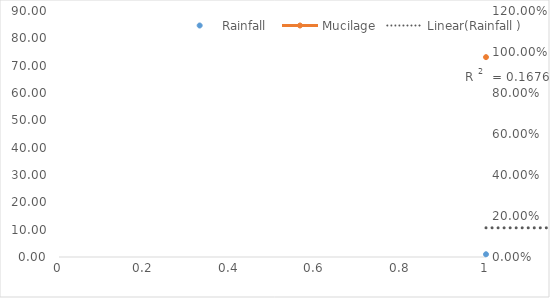
| Category | Rainfall  |
|---|---|
| 0 | 1 |
| 1 | 13.2 |
| 2 | 0.2 |
| 3 | 72.2 |
| 4 | 9.6 |
| 5 | 13.6 |
| 6 | 0.4 |
| 7 | 22.8 |
| 8 | 15.4 |
| 9 | 0 |
| 10 | 29.2 |
| 11 | 15.4 |
| 12 | 1.4 |
| 13 | 9.4 |
| 14 | 2.4 |
| 15 | 21.8 |
| 16 | 0.4 |
| 17 | 14.8 |
| 18 | 7 |
| 19 | 0 |
| 20 | 0 |
| 21 | 20 |
| 22 | 21.6 |
| 23 | 26.8 |
| 24 | 2.2 |
| 25 | 5.6 |
| 26 | 35 |
| 27 | 0 |
| 28 | 0.2 |
| 29 | 0.2 |
| 30 | 33 |
| 31 | 8.4 |
| 32 | 8.4 |
| 33 | 0 |
| 34 | 0 |
| 35 | 23.8 |
| 36 | 10.8 |
| 37 | 0.4 |
| 38 | 3 |
| 39 | 0.4 |
| 40 | 0 |
| 41 | 35.6 |
| 42 | 8.4 |
| 43 | 17.2 |
| 44 | 0.2 |
| 45 | 4.2 |
| 46 | 1.4 |
| 47 | 0.6 |
| 48 | 6.2 |
| 49 | 39.8 |
| 50 | 1.4 |
| 51 | 0.2 |
| 52 | 28.4 |
| 53 | 1.6 |
| 54 | 11 |
| 55 | 0.8 |
| 56 | 1.6 |
| 57 | 6.8 |
| 58 | 0.2 |
| 59 | 0.2 |
| 60 | 0 |
| 61 | 4.8 |
| 62 | 36.6 |
| 63 | 43.6 |
| 64 | 3 |
| 65 | 0.2 |
| 66 | 19.4 |
| 67 | 11.6 |
| 68 | 8.4 |
| 69 | 1.6 |
| 70 | 13.2 |
| 71 | 0 |
| 72 | 15.2 |
| 73 | 0 |
| 74 | 3 |
| 75 | 26.2 |
| 76 | 78.4 |
| 77 | 4.2 |
| 78 | 36.4 |
| 79 | 0 |
| 80 | 0 |
| 81 | 6 |
| 82 | 25.4 |
| 83 | 1.2 |
| 84 | 10.6 |
| 85 | 8.2 |
| 86 | 19.8 |
| 87 | 0 |
| 88 | 14 |
| 89 | 0 |
| 90 | 0 |
| 91 | 0 |
| 92 | 0.6 |
| 93 | 9 |
| 94 | 11.6 |
| 95 | 15.2 |
| 96 | 0 |
| 97 | 0.2 |
| 98 | 19 |
| 99 | 0.2 |
| 100 | 2.2 |
| 101 | 0.6 |
| 102 | 0.6 |
| 103 | 0.6 |
| 104 | 0 |
| 105 | 0.2 |
| 106 | 40 |
| 107 | 0 |
| 108 | 0 |
| 109 | 0 |
| 110 | 6.6 |
| 111 | 23.6 |
| 112 | 7.8 |
| 113 | 3.8 |
| 114 | 0 |
| 115 | 0 |
| 116 | 0 |
| 117 | 0 |
| 118 | 0.6 |
| 119 | 0 |
| 120 | 0 |
| 121 | 0 |
| 122 | 0 |
| 123 | 0 |
| 124 | 0.2 |
| 125 | 3.6 |
| 126 | 0 |
| 127 | 0.2 |
| 128 | 1 |
| 129 | 0 |
| 130 | 2.2 |
| 131 | 0 |
| 132 | 0 |
| 133 | 0 |
| 134 | 6.2 |
| 135 | 1 |
| 136 | 0 |
| 137 | 40.6 |
| 138 | 0 |
| 139 | 2.6 |
| 140 | 0 |
| 141 | 4.6 |
| 142 | 0.4 |
| 143 | 0 |
| 144 | 0 |
| 145 | 0 |
| 146 | 8.4 |
| 147 | 0 |
| 148 | 0 |
| 149 | 0 |
| 150 | 5.8 |
| 151 | 0 |
| 152 | 9.2 |
| 153 | 0 |
| 154 | 0 |
| 155 | 0 |
| 156 | 8.8 |
| 157 | 9.2 |
| 158 | 1.2 |
| 159 | 0 |
| 160 | 0 |
| 161 | 0 |
| 162 | 0 |
| 163 | 0 |
| 164 | 0 |
| 165 | 0 |
| 166 | 0 |
| 167 | 0 |
| 168 | 0 |
| 169 | 0 |
| 170 | 0 |
| 171 | 0 |
| 172 | 0 |
| 173 | 0 |
| 174 | 0 |
| 175 | 0 |
| 176 | 0 |
| 177 | 0 |
| 178 | 0 |
| 179 | 0 |
| 180 | 0 |
| 181 | 0 |
| 182 | 0 |
| 183 | 0 |
| 184 | 0 |
| 185 | 0 |
| 186 | 0 |
| 187 | 0 |
| 188 | 0 |
| 189 | 0 |
| 190 | 0 |
| 191 | 0 |
| 192 | 0 |
| 193 | 0 |
| 194 | 0.2 |
| 195 | 0 |
| 196 | 0 |
| 197 | 0 |
| 198 | 0 |
| 199 | 0 |
| 200 | 0 |
| 201 | 0 |
| 202 | 0 |
| 203 | 0 |
| 204 | 0 |
| 205 | 0 |
| 206 | 0 |
| 207 | 0 |
| 208 | 0 |
| 209 | 0 |
| 210 | 0 |
| 211 | 0 |
| 212 | 0 |
| 213 | 0 |
| 214 | 0.2 |
| 215 | 0.2 |
| 216 | 0 |
| 217 | 0 |
| 218 | 0.2 |
| 219 | 0 |
| 220 | 0 |
| 221 | 0 |
| 222 | 0 |
| 223 | 0 |
| 224 | 0 |
| 225 | 0 |
| 226 | 0 |
| 227 | 0 |
| 228 | 0.2 |
| 229 | 0 |
| 230 | 0 |
| 231 | 0 |
| 232 | 0 |
| 233 | 0 |
| 234 | 0.2 |
| 235 | 0 |
| 236 | 0.2 |
| 237 | 0 |
| 238 | 0.2 |
| 239 | 0 |
| 240 | 8 |
| 241 | 0 |
| 242 | 0 |
| 243 | 0 |
| 244 | 0.2 |
| 245 | 0 |
| 246 | 0 |
| 247 | 0 |
| 248 | 0 |
| 249 | 0 |
| 250 | 0 |
| 251 | 0 |
| 252 | 0 |
| 253 | 0 |
| 254 | 0 |
| 255 | 0.2 |
| 256 | 0 |
| 257 | 0 |
| 258 | 12.4 |
| 259 | 0 |
| 260 | 0 |
| 261 | 0 |
| 262 | 0 |
| 263 | 0 |
| 264 | 0 |
| 265 | 0 |
| 266 | 11 |
| 267 | 0 |
| 268 | 0 |
| 269 | 0 |
| 270 | 0 |
| 271 | 0 |
| 272 | 0 |
| 273 | 0 |
| 274 | 0 |
| 275 | 8.8 |
| 276 | 0 |
| 277 | 0 |
| 278 | 0 |
| 279 | 0 |
| 280 | 0 |
| 281 | 0 |
| 282 | 0 |
| 283 | 0 |
| 284 | 0 |
| 285 | 0 |
| 286 | 0 |
| 287 | 0 |
| 288 | 0 |
| 289 | 0 |
| 290 | 0 |
| 291 | 0 |
| 292 | 0 |
| 293 | 0 |
| 294 | 0 |
| 295 | 0 |
| 296 | 0 |
| 297 | 0 |
| 298 | 0 |
| 299 | 0 |
| 300 | 0 |
| 301 | 0 |
| 302 | 0 |
| 303 | 0 |
| 304 | 0 |
| 305 | 0.8 |
| 306 | 0 |
| 307 | 0 |
| 308 | 0 |
| 309 | 0 |
| 310 | 0 |
| 311 | 0 |
| 312 | 0 |
| 313 | 0 |
| 314 | 0 |
| 315 | 0 |
| 316 | 0 |
| 317 | 0 |
| 318 | 0 |
| 319 | 0 |
| 320 | 0 |
| 321 | 0 |
| 322 | 0 |
| 323 | 0 |
| 324 | 0 |
| 325 | 0 |
| 326 | 3.6 |
| 327 | 0 |
| 328 | 0 |
| 329 | 6.8 |
| 330 | 0 |
| 331 | 0 |
| 332 | 0 |
| 333 | 0 |
| 334 | 6.2 |
| 335 | 0 |
| 336 | 0 |
| 337 | 0 |
| 338 | 0 |
| 339 | 0 |
| 340 | 0 |
| 341 | 0 |